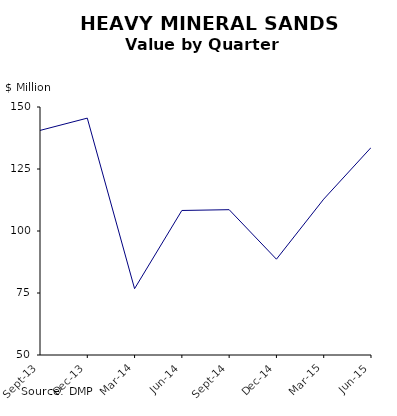
| Category | Series 0 |
|---|---|
| 2013-09-01 | 140.55 |
| 2013-12-01 | 145.509 |
| 2014-03-01 | 76.745 |
| 2014-06-01 | 108.273 |
| 2014-09-01 | 108.596 |
| 2014-12-01 | 88.632 |
| 2015-03-01 | 112.851 |
| 2015-06-01 | 133.623 |